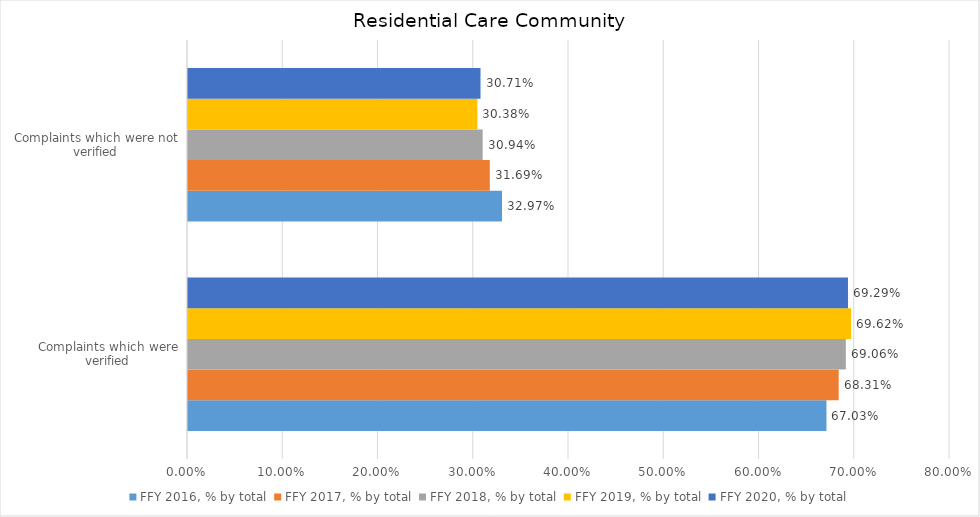
| Category | FFY 2016, % by total | FFY 2017, % by total | FFY 2018, % by total | FFY 2019, % by total | FFY 2020, % by total |
|---|---|---|---|---|---|
| Complaints which were verified | 0.67 | 0.683 | 0.691 | 0.696 | 0.693 |
| Complaints which were not verified | 0.33 | 0.317 | 0.309 | 0.304 | 0.307 |